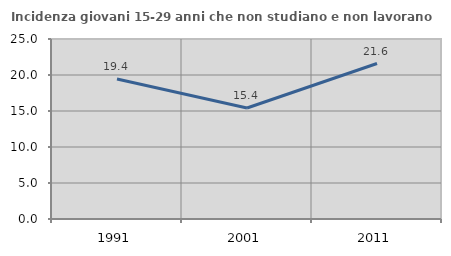
| Category | Incidenza giovani 15-29 anni che non studiano e non lavorano  |
|---|---|
| 1991.0 | 19.435 |
| 2001.0 | 15.411 |
| 2011.0 | 21.593 |